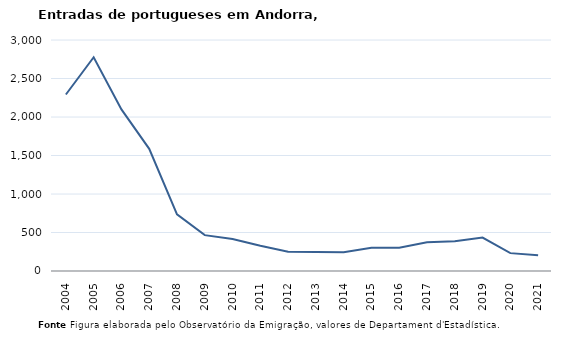
| Category | Entradas |
|---|---|
| 2004.0 | 2292 |
| 2005.0 | 2776 |
| 2006.0 | 2099 |
| 2007.0 | 1587 |
| 2008.0 | 736 |
| 2009.0 | 466 |
| 2010.0 | 415 |
| 2011.0 | 327 |
| 2012.0 | 250 |
| 2013.0 | 246 |
| 2014.0 | 244 |
| 2015.0 | 303 |
| 2016.0 | 301 |
| 2017.0 | 372 |
| 2018.0 | 386 |
| 2019.0 | 434 |
| 2020.0 | 232 |
| 2021.0 | 206 |